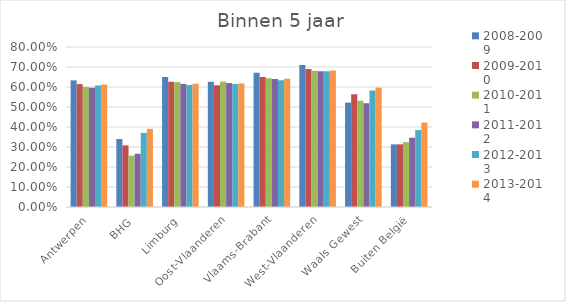
| Category | 2008-2009 | 2009-2010 | 2010-2011 | 2011-2012 | 2012-2013 | 2013-2014 |
|---|---|---|---|---|---|---|
| Antwerpen | 0.633 | 0.614 | 0.6 | 0.596 | 0.608 | 0.612 |
| BHG | 0.34 | 0.308 | 0.257 | 0.266 | 0.37 | 0.391 |
| Limburg | 0.65 | 0.626 | 0.624 | 0.615 | 0.61 | 0.617 |
| Oost-Vlaanderen | 0.626 | 0.609 | 0.627 | 0.62 | 0.615 | 0.618 |
| Vlaams-Brabant | 0.671 | 0.651 | 0.643 | 0.64 | 0.634 | 0.641 |
| West-Vlaanderen | 0.71 | 0.69 | 0.681 | 0.679 | 0.678 | 0.682 |
| Waals Gewest | 0.522 | 0.564 | 0.531 | 0.519 | 0.583 | 0.597 |
| Buiten België | 0.313 | 0.313 | 0.324 | 0.347 | 0.385 | 0.423 |